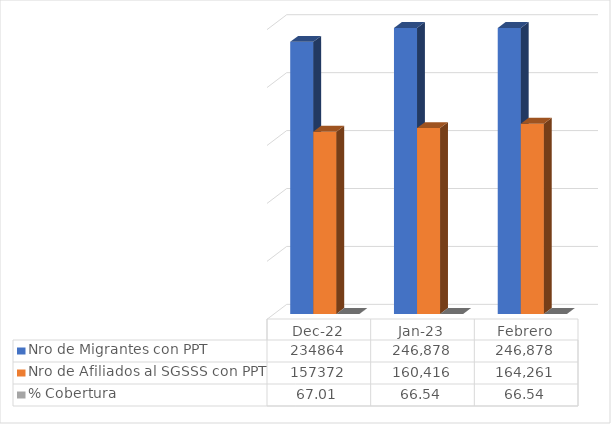
| Category | Nro de Migrantes con PPT  | Nro de Afiliados al SGSSS con PPT | % Cobertura |
|---|---|---|---|
| dic-22 | 234864 | 157372 | 67.006 |
| ene-23 | 246878 | 160416 | 66.535 |
| Febrero | 246878 | 164261 | 66.535 |